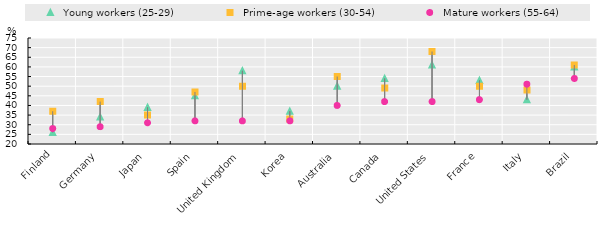
| Category |   Young workers (25-29) |   Prime-age workers (30-54) |   Mature workers (55-64) |
|---|---|---|---|
| Finland | 26 | 37 | 28 |
| Germany | 34 | 42 | 29 |
| Japan | 39 | 35 | 31 |
| Spain | 45 | 47 | 32 |
| United Kingdom | 58 | 50 | 32 |
| Korea | 37 | 33 | 32 |
| Australia | 50 | 55 | 40 |
| Canada | 54 | 49 | 42 |
| United States | 61 | 68 | 42 |
| France | 53 | 50 | 43 |
| Italy | 43 | 48 | 51 |
| Brazil | 60 | 61 | 54 |